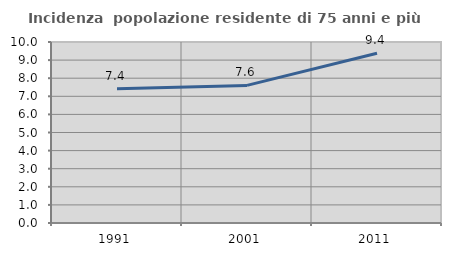
| Category | Incidenza  popolazione residente di 75 anni e più |
|---|---|
| 1991.0 | 7.416 |
| 2001.0 | 7.603 |
| 2011.0 | 9.377 |